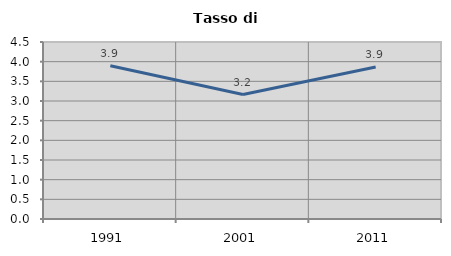
| Category | Tasso di disoccupazione   |
|---|---|
| 1991.0 | 3.895 |
| 2001.0 | 3.165 |
| 2011.0 | 3.866 |